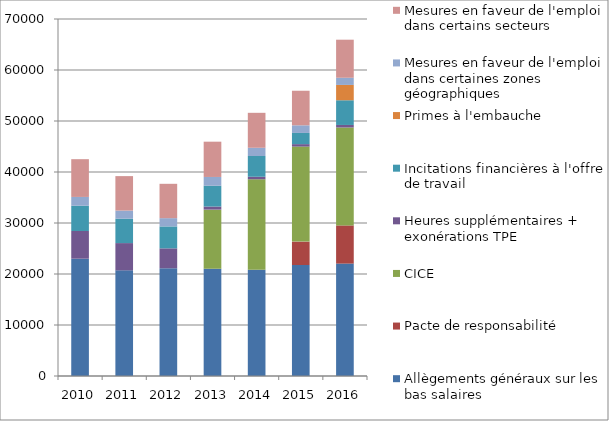
| Category | Allègements généraux sur les bas salaires  | Pacte de responsabilité | CICE  | Heures supplémentaires + exonérations TPE | Incitations financières à l'offre de travail | Primes à l'embauche | Mesures en faveur de l'emploi dans certaines zones géographiques | Mesures en faveur de l'emploi dans certains secteurs |
|---|---|---|---|---|---|---|---|---|
| 2010.0 | 22998.325 | 0 | 0 | 5437.521 | 4946.825 | 0 | 1728.9 | 7401.595 |
| 2011.0 | 20715.759 | 0 | 0 | 5345.972 | 4779.335 | 0 | 1594.107 | 6759.75 |
| 2012.0 | 21131.188 | 0 | 0 | 3899.705 | 4300.384 | 0 | 1618.899 | 6735.052 |
| 2013.0 | 21036.188 | 0 | 11583.25 | 607.033 | 4074.332 | 0 | 1725.401 | 6919.269 |
| 2014.0 | 20834.415 | 0 | 17738.956 | 491.67 | 4072.944 | 0 | 1612.541 | 6853.952 |
| 2015.0 | 21762.101 | 4589.246 | 18633.48 | 479.862 | 2192.94 | 0.01 | 1496.689 | 6779.181 |
| 2016.0 | 22041 | 7485 | 19200 | 497 | 4845.267 | 3005.83 | 1404 | 7463 |